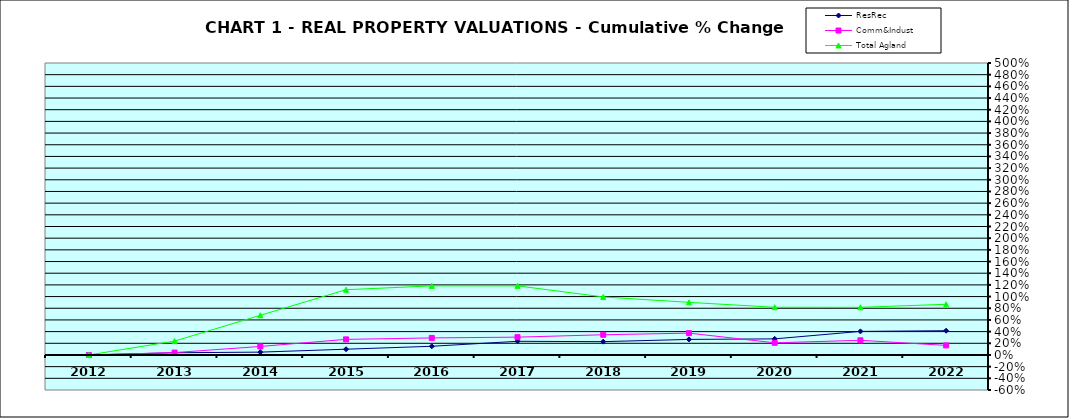
| Category | ResRec | Comm&Indust | Total Agland |
|---|---|---|---|
| 2012.0 | 0 | 0 | 0 |
| 2013.0 | 0.038 | 0.041 | 0.238 |
| 2014.0 | 0.048 | 0.146 | 0.68 |
| 2015.0 | 0.098 | 0.267 | 1.117 |
| 2016.0 | 0.149 | 0.292 | 1.183 |
| 2017.0 | 0.234 | 0.305 | 1.183 |
| 2018.0 | 0.228 | 0.346 | 0.994 |
| 2019.0 | 0.266 | 0.374 | 0.901 |
| 2020.0 | 0.276 | 0.208 | 0.817 |
| 2021.0 | 0.404 | 0.251 | 0.816 |
| 2022.0 | 0.415 | 0.164 | 0.868 |